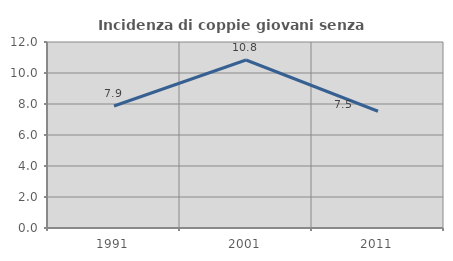
| Category | Incidenza di coppie giovani senza figli |
|---|---|
| 1991.0 | 7.869 |
| 2001.0 | 10.837 |
| 2011.0 | 7.533 |